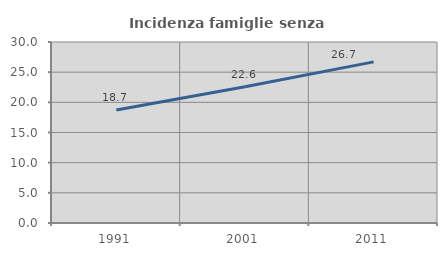
| Category | Incidenza famiglie senza nuclei |
|---|---|
| 1991.0 | 18.72 |
| 2001.0 | 22.594 |
| 2011.0 | 26.709 |